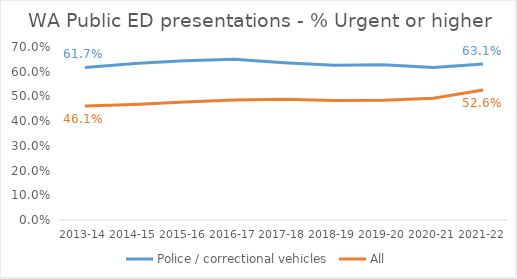
| Category | Police / correctional vehicles | All |
|---|---|---|
| 2013-14 | 0.617 | 0.461 |
| 2014-15 | 0.633 | 0.467 |
| 2015-16 | 0.644 | 0.477 |
| 2016-17 | 0.65 | 0.485 |
| 2017-18 | 0.636 | 0.488 |
| 2018-19 | 0.626 | 0.483 |
| 2019-20 | 0.628 | 0.485 |
| 2020-21 | 0.617 | 0.493 |
| 2021-22 | 0.631 | 0.526 |